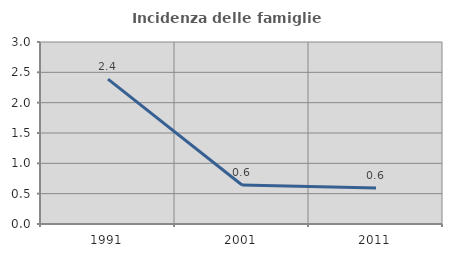
| Category | Incidenza delle famiglie numerose |
|---|---|
| 1991.0 | 2.389 |
| 2001.0 | 0.643 |
| 2011.0 | 0.592 |